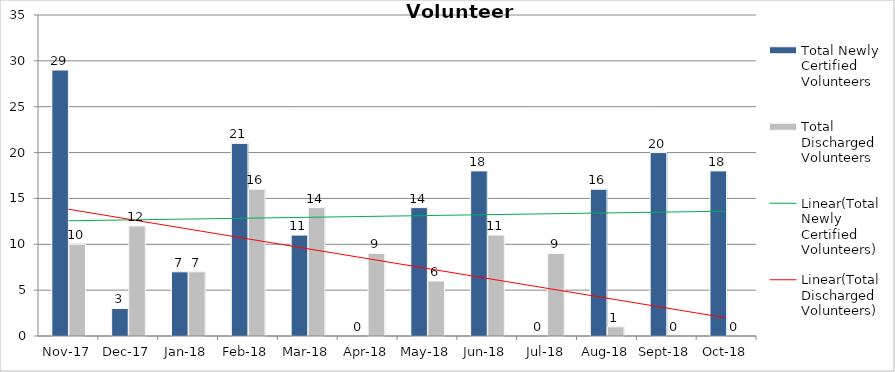
| Category | Total Newly Certified Volunteers | Total Discharged Volunteers |
|---|---|---|
| 2017-11-01 | 29 | 10 |
| 2017-12-01 | 3 | 12 |
| 2018-01-01 | 7 | 7 |
| 2018-02-01 | 21 | 16 |
| 2018-03-01 | 11 | 14 |
| 2018-04-01 | 0 | 9 |
| 2018-05-01 | 14 | 6 |
| 2018-06-01 | 18 | 11 |
| 2018-07-01 | 0 | 9 |
| 2018-08-01 | 16 | 1 |
| 2018-09-01 | 20 | 0 |
| 2018-10-01 | 18 | 0 |